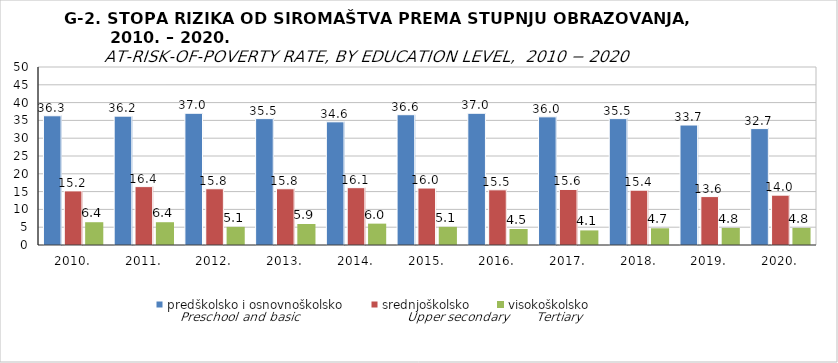
| Category | predškolsko i osnovnoškolsko | srednjoškolsko | visokoškolsko |
|---|---|---|---|
| 2010. | 36.3 | 15.2 | 6.4 |
| 2011. | 36.2 | 16.4 | 6.4 |
| 2012. | 37 | 15.8 | 5.1 |
| 2013. | 35.5 | 15.8 | 5.9 |
| 2014. | 34.6 | 16.1 | 6 |
| 2015. | 36.6 | 16 | 5.1 |
| 2016. | 37 | 15.5 | 4.5 |
| 2017. | 36 | 15.6 | 4.1 |
| 2018. | 35.5 | 15.4 | 4.7 |
| 2019. | 33.7 | 13.6 | 4.8 |
| 2020. | 32.7 | 14 | 4.8 |